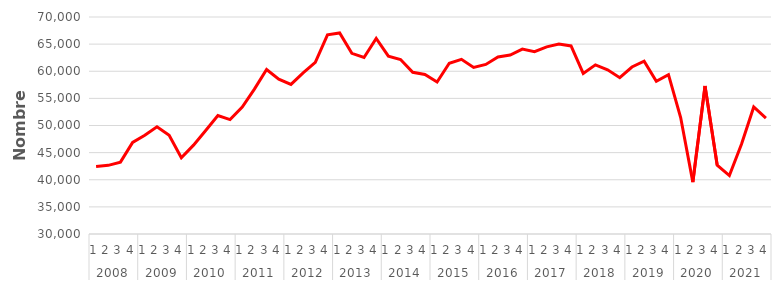
| Category | Série CVS-CJO* |
|---|---|
| 0 | 42453.225 |
| 1 | 42656.525 |
| 2 | 43251.46 |
| 3 | 46889.802 |
| 4 | 48200.972 |
| 5 | 49765.788 |
| 6 | 48199.733 |
| 7 | 44055.482 |
| 8 | 46377.746 |
| 9 | 49076.584 |
| 10 | 51842.205 |
| 11 | 51095.679 |
| 12 | 53414.76 |
| 13 | 56702.274 |
| 14 | 60311.035 |
| 15 | 58526.231 |
| 16 | 57578.304 |
| 17 | 59691.481 |
| 18 | 61626.637 |
| 19 | 66717.707 |
| 20 | 67066.137 |
| 21 | 63304.366 |
| 22 | 62545.281 |
| 23 | 66051.44 |
| 24 | 62790.569 |
| 25 | 62172.491 |
| 26 | 59803.532 |
| 27 | 59394.419 |
| 28 | 58018.479 |
| 29 | 61472.428 |
| 30 | 62196.489 |
| 31 | 60703.266 |
| 32 | 61257.628 |
| 33 | 62639.8 |
| 34 | 62992.492 |
| 35 | 64075.034 |
| 36 | 63610.248 |
| 37 | 64494.875 |
| 38 | 65009.31 |
| 39 | 64672.105 |
| 40 | 59600.379 |
| 41 | 61172.198 |
| 42 | 60278.19 |
| 43 | 58813.677 |
| 44 | 60783.729 |
| 45 | 61843.069 |
| 46 | 58142.507 |
| 47 | 59365.98 |
| 48 | 51475.917 |
| 49 | 39563.026 |
| 50 | 57286.1 |
| 51 | 42694.206 |
| 52 | 40768.845 |
| 53 | 46591.143 |
| 54 | 53412.053 |
| 55 | 51370.395 |